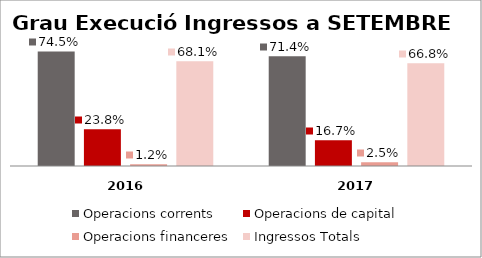
| Category | Operacions corrents | Operacions de capital | Operacions financeres | Ingressos Totals |
|---|---|---|---|---|
| 0 | 0.745 | 0.238 | 0.012 | 0.681 |
| 1 | 0.714 | 0.167 | 0.025 | 0.668 |